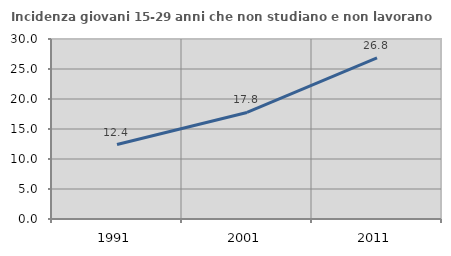
| Category | Incidenza giovani 15-29 anni che non studiano e non lavorano  |
|---|---|
| 1991.0 | 12.407 |
| 2001.0 | 17.757 |
| 2011.0 | 26.842 |